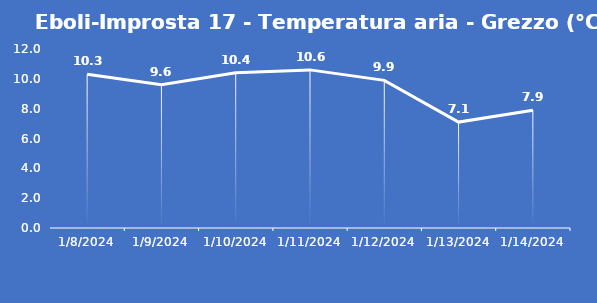
| Category | Eboli-Improsta 17 - Temperatura aria - Grezzo (°C) |
|---|---|
| 1/8/24 | 10.3 |
| 1/9/24 | 9.6 |
| 1/10/24 | 10.4 |
| 1/11/24 | 10.6 |
| 1/12/24 | 9.9 |
| 1/13/24 | 7.1 |
| 1/14/24 | 7.9 |